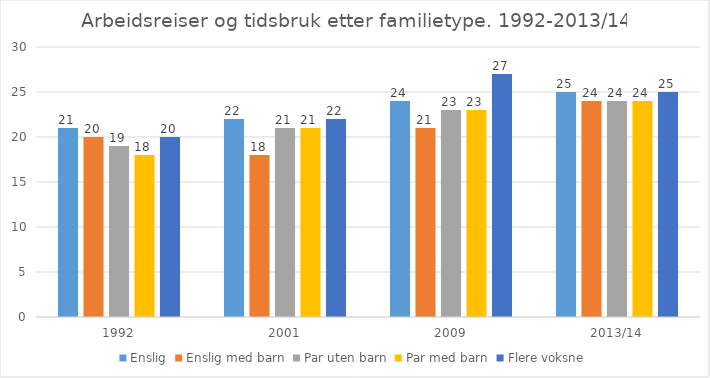
| Category | Enslig | Enslig med barn | Par uten barn | Par med barn | Flere voksne |
|---|---|---|---|---|---|
| 1992 | 21 | 20 | 19 | 18 | 20 |
| 2001 | 22 | 18 | 21 | 21 | 22 |
| 2009 | 24 | 21 | 23 | 23 | 27 |
| 2013/14 | 25 | 24 | 24 | 24 | 25 |